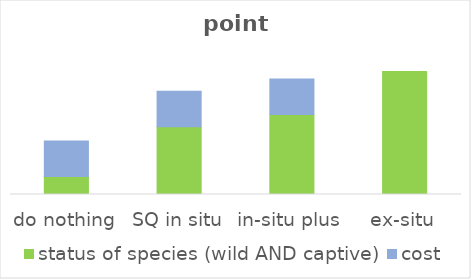
| Category | status of species (wild AND captive) | cost |
|---|---|---|
| do nothing | 0.085 | 0.167 |
| SQ in situ | 0.319 | 0.167 |
| in-situ plus | 0.375 | 0.167 |
| ex-situ | 0.578 | 0 |